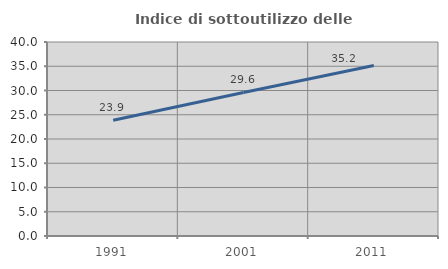
| Category | Indice di sottoutilizzo delle abitazioni  |
|---|---|
| 1991.0 | 23.854 |
| 2001.0 | 29.604 |
| 2011.0 | 35.171 |